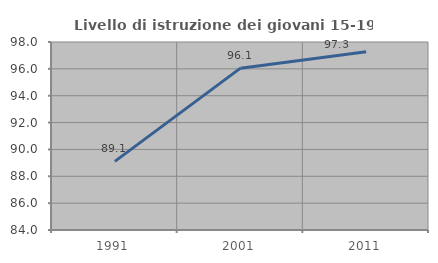
| Category | Livello di istruzione dei giovani 15-19 anni |
|---|---|
| 1991.0 | 89.109 |
| 2001.0 | 96.053 |
| 2011.0 | 97.273 |